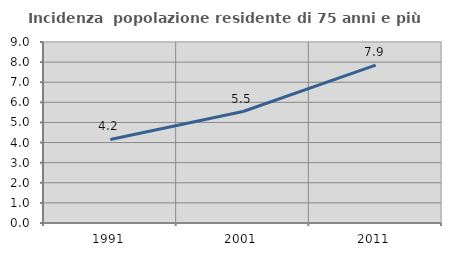
| Category | Incidenza  popolazione residente di 75 anni e più |
|---|---|
| 1991.0 | 4.154 |
| 2001.0 | 5.543 |
| 2011.0 | 7.852 |